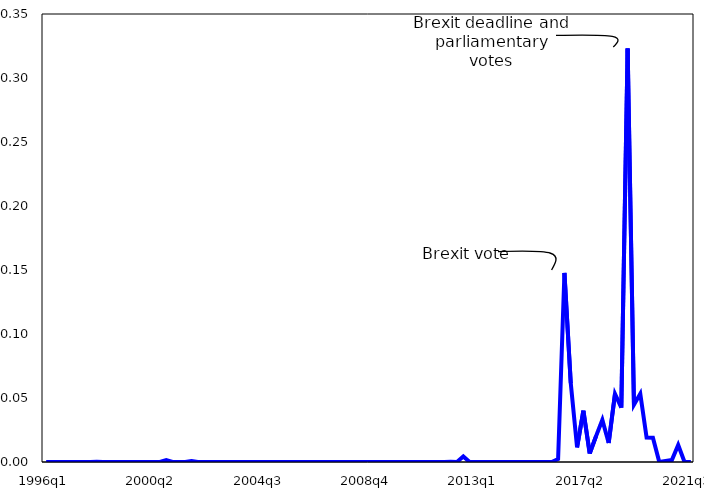
| Category | Series 0 |
|---|---|
| 1996q1 | 0 |
| 1996q2 | 0 |
| 1996q3 | 0 |
| 1996q4 | 0 |
| 1997q1 | 0 |
| 1997q2 | 0 |
| 1997q3 | 0 |
| 1997q4 | 0 |
| 1998q1 | 0 |
| 1998q2 | 0 |
| 1998q3 | 0 |
| 1998q4 | 0 |
| 1999q1 | 0 |
| 1999q2 | 0 |
| 1999q3 | 0 |
| 1999q4 | 0 |
| 2000q1 | 0 |
| 2000q2 | 0 |
| 2000q3 | 0 |
| 2000q4 | 0.001 |
| 2001q1 | 0 |
| 2001q2 | 0 |
| 2001q3 | 0 |
| 2001q4 | 0.001 |
| 2002q1 | 0 |
| 2002q2 | 0 |
| 2002q3 | 0 |
| 2002q4 | 0 |
| 2003q1 | 0 |
| 2003q2 | 0 |
| 2003q3 | 0 |
| 2003q4 | 0 |
| 2004q1 | 0 |
| 2004q2 | 0 |
| 2004q3 | 0 |
| 2004q4 | 0 |
| 2005q1 | 0 |
| 2005q2 | 0 |
| 2005q3 | 0 |
| 2005q4 | 0 |
| 2006q1 | 0 |
| 2006q2 | 0 |
| 2006q3 | 0 |
| 2006q4 | 0 |
| 2007q1 | 0 |
| 2007q2 | 0 |
| 2007q3 | 0 |
| 2007q4 | 0 |
| 2008q1 | 0 |
| 2008q2 | 0 |
| 2008q3 | 0 |
| 2008q4 | 0 |
| 2009q1 | 0 |
| 2009q2 | 0 |
| 2009q3 | 0 |
| 2009q4 | 0 |
| 2010q1 | 0 |
| 2010q2 | 0 |
| 2010q3 | 0 |
| 2010q4 | 0 |
| 2011q1 | 0 |
| 2011q2 | 0 |
| 2011q3 | 0 |
| 2011q4 | 0 |
| 2012q1 | 0 |
| 2012q2 | 0 |
| 2012q3 | 0.004 |
| 2012q4 | 0 |
| 2013q1 | 0 |
| 2013q2 | 0 |
| 2013q3 | 0 |
| 2013q4 | 0 |
| 2014q1 | 0 |
| 2014q2 | 0 |
| 2014q3 | 0 |
| 2014q4 | 0 |
| 2015q1 | 0 |
| 2015q2 | 0 |
| 2015q3 | 0 |
| 2015q4 | 0 |
| 2016q1 | 0 |
| 2016q2 | 0.002 |
| 2016q3 | 0.148 |
| 2016q4 | 0.062 |
| 2017q1 | 0.011 |
| 2017q2 | 0.04 |
| 2017q3 | 0.007 |
| 2017q4 | 0.02 |
| 2018q1 | 0.033 |
| 2018q2 | 0.015 |
| 2018q3 | 0.053 |
| 2018q4 | 0.042 |
| 2019q1 | 0.323 |
| 2019q2 | 0.045 |
| 2019q3 | 0.053 |
| 2019q4 | 0.019 |
| 2020q1 | 0.019 |
| 2020q2 | 0 |
| 2020q3 | 0.001 |
| 2020q4 | 0.002 |
| 2021q1 | 0.013 |
| 2021q2 | 0 |
| 2021q3 | 0 |